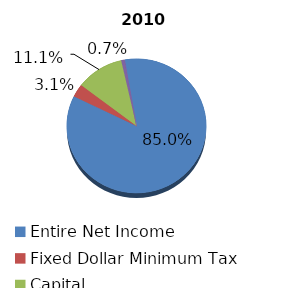
| Category | 2010 |
|---|---|
| Entire Net Income | 1798655555 |
| Fixed Dollar Minimum Tax | 66130632 |
| Capital | 234740990 |
| Alternative Minimum Taxable Income | 15712686 |